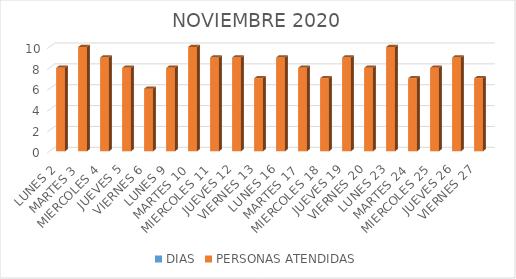
| Category | DIAS | PERSONAS ATENDIDAS |
|---|---|---|
| LUNES 2 |  | 8 |
| MARTES 3 |  | 10 |
| MIERCOLES 4 |  | 9 |
| JUEVES 5 |  | 8 |
| VIERNES 6 |  | 6 |
| LUNES 9 |  | 8 |
| MARTES 10 |  | 10 |
| MIERCOLES 11 |  | 9 |
| JUEVES 12 |  | 9 |
| VIERNES 13 |  | 7 |
| LUNES 16 |  | 9 |
| MARTES 17 |  | 8 |
| MIERCOLES 18 |  | 7 |
| JUEVES 19 |  | 9 |
| VIERNES 20 |  | 8 |
| LUNES 23 |  | 10 |
| MARTES 24 |  | 7 |
| MIERCOLES 25 |  | 8 |
| JUEVES 26 |  | 9 |
| VIERNES 27 |  | 7 |